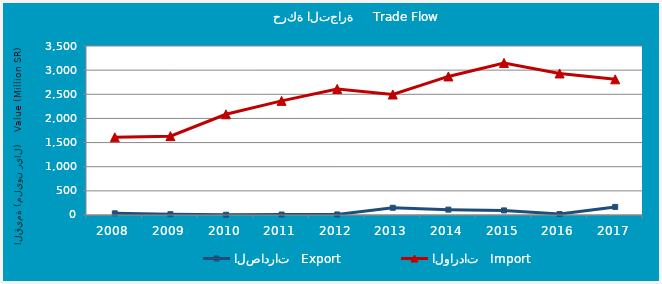
| Category | الصادرات   Export | الواردات   Import |
|---|---|---|
| 2008.0 | 34315681 | 1609385166 |
| 2009.0 | 16561622 | 1632975835 |
| 2010.0 | 5060935 | 2085454292 |
| 2011.0 | 9674971 | 2363724280 |
| 2012.0 | 11138308 | 2611178110 |
| 2013.0 | 150026178 | 2495529003 |
| 2014.0 | 111201057 | 2869779629 |
| 2015.0 | 94996742 | 3149109769 |
| 2016.0 | 19439242 | 2931268488 |
| 2017.0 | 167206465 | 2809662576 |